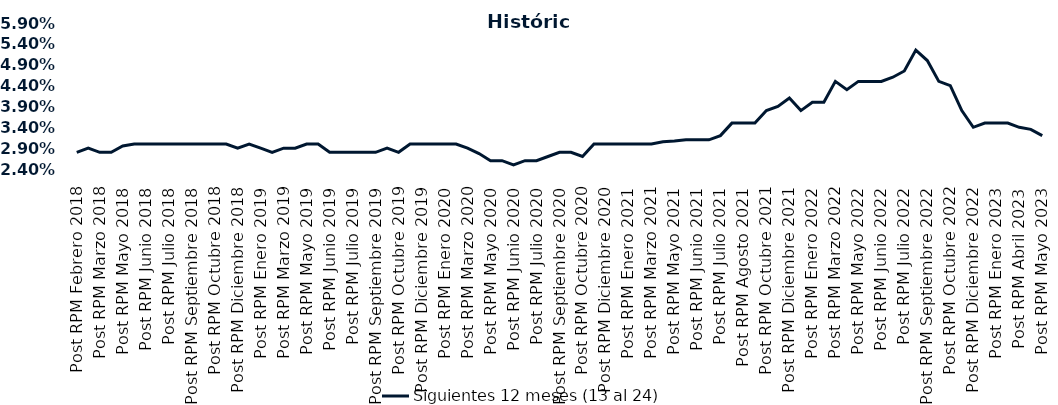
| Category | Siguientes 12 meses (13 al 24)  |
|---|---|
| Post RPM Febrero 2018 | 0.028 |
| Pre RPM Marzo 2018 | 0.029 |
| Post RPM Marzo 2018 | 0.028 |
| Pre RPM Mayo 2018 | 0.028 |
| Post RPM Mayo 2018 | 0.03 |
| Pre RPM Junio 2018 | 0.03 |
| Post RPM Junio 2018 | 0.03 |
| Pre RPM Julio 2018 | 0.03 |
| Post RPM Julio 2018 | 0.03 |
| Pre RPM Septiembre 2018 | 0.03 |
| Post RPM Septiembre 2018 | 0.03 |
| Pre RPM Octubre 2018 | 0.03 |
| Post RPM Octubre 2018 | 0.03 |
| Pre RPM Diciembre 2018 | 0.03 |
| Post RPM Diciembre 2018 | 0.029 |
| Pre RPM Enero 2019 | 0.03 |
| Post RPM Enero 2019 | 0.029 |
| Pre RPM Marzo 2019 | 0.028 |
| Post RPM Marzo 2019 | 0.029 |
| Pre RPM Mayo 2019 | 0.029 |
| Post RPM Mayo 2019 | 0.03 |
| Pre RPM Junio 2019 | 0.03 |
| Post RPM Junio 2019 | 0.028 |
| Pre RPM Julio 2019 | 0.028 |
| Post RPM Julio 2019 | 0.028 |
| Pre RPM Septiembre 2019 | 0.028 |
| Post RPM Septiembre 2019 | 0.028 |
| Pre RPM Octubre 2019 | 0.029 |
| Post RPM Octubre 2019 | 0.028 |
| Pre RPM Diciembre 2019 | 0.03 |
| Post RPM Diciembre 2019 | 0.03 |
| Pre RPM Enero 2020 | 0.03 |
| Post RPM Enero 2020 | 0.03 |
| Pre RPM Marzo 2020 | 0.03 |
| Post RPM Marzo 2020 | 0.029 |
| Pre RPM Mayo 2020 | 0.028 |
| Post RPM Mayo 2020 | 0.026 |
| Pre RPM Junio 2020 | 0.026 |
| Post RPM Junio 2020 | 0.025 |
| Pre RPM Julio 2020 | 0.026 |
| Post RPM Julio 2020 | 0.026 |
| Pre RPM Septiembre 2020 | 0.027 |
| Post RPM Septiembre 2020 | 0.028 |
| Pre RPM Octubre 2020 | 0.028 |
| Post RPM Octubre 2020 | 0.027 |
| Pre RPM Diciembre 2020 | 0.03 |
| Post RPM Diciembre 2020 | 0.03 |
| Pre RPM Enero 2021 | 0.03 |
| Post RPM Enero 2021 | 0.03 |
| Pre RPM Marzo 2021 | 0.03 |
| Post RPM Marzo 2021 | 0.03 |
| Pre RPM Mayo 2021 | 0.031 |
| Post RPM Mayo 2021 | 0.031 |
| Pre RPM Junio 2021 | 0.031 |
| Post RPM Junio 2021 | 0.031 |
| Pre RPM Julio 2021 | 0.031 |
| Post RPM Julio 2021 | 0.032 |
| Pre RPM Agosto 2021 | 0.035 |
| Post RPM Agosto 2021 | 0.035 |
| Pre RPM Octubre 2021 | 0.035 |
| Post RPM Octubre 2021 | 0.038 |
| Pre RPM Diciembre 2021 | 0.039 |
| Post RPM Diciembre 2021 | 0.041 |
| Pre RPM Enero 2022 | 0.038 |
| Post RPM Enero 2022 | 0.04 |
| Pre RPM Marzo 2022 | 0.04 |
| Post RPM Marzo 2022 | 0.045 |
| Pre RPM Mayo 2022 | 0.043 |
| Post RPM Mayo 2022 | 0.045 |
| Pre RPM Junio 2022 | 0.045 |
| Post RPM Junio 2022 | 0.045 |
| Pre RPM Julio 2022 | 0.046 |
| Post RPM Julio 2022 | 0.048 |
| Pre RPM Septiembre 2022 | 0.052 |
| Post RPM Septiembre 2022 | 0.05 |
| Pre RPM Octubre 2022 | 0.045 |
| Post RPM Octubre 2022 | 0.044 |
| Pre RPM Diciembre 2022 | 0.038 |
| Post RPM Diciembre 2022 | 0.034 |
| Pre RPM Enero 2023 | 0.035 |
| Post RPM Enero 2023 | 0.035 |
| Pre RPM Abril 2023 | 0.035 |
| Post RPM Abril 2023 | 0.034 |
| Pre RPM Mayo 2023 | 0.034 |
| Post RPM Mayo 2023 | 0.032 |